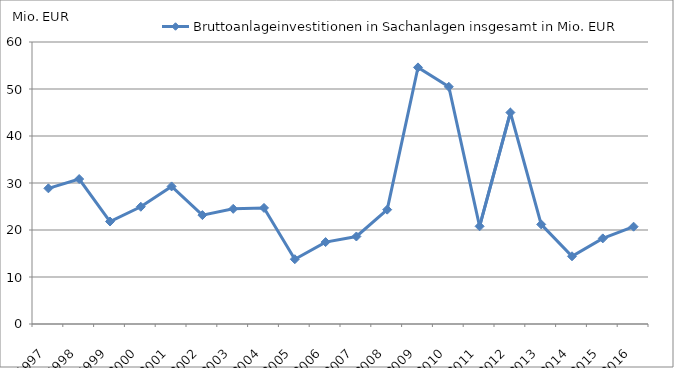
| Category | Bruttoanlageinvestitionen in Sachanlagen insgesamt in Mio. EUR |
|---|---|
| 1997.0 | 28.865 |
| 1998.0 | 30.842 |
| 1999.0 | 21.802 |
| 2000.0 | 24.946 |
| 2001.0 | 29.275 |
| 2002.0 | 23.169 |
| 2003.0 | 24.503 |
| 2004.0 | 24.7 |
| 2005.0 | 13.785 |
| 2006.0 | 17.429 |
| 2007.0 | 18.62 |
| 2008.0 | 24.327 |
| 2009.0 | 54.596 |
| 2010.0 | 50.471 |
| 2011.0 | 20.783 |
| 2012.0 | 45 |
| 2013.0 | 21.19 |
| 2014.0 | 14.408 |
| 2015.0 | 18.216 |
| 2016.0 | 20.707 |